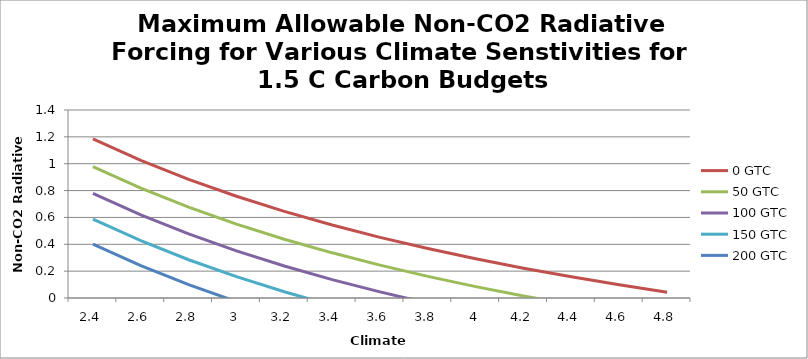
| Category | 0 GTC | 50 GTC | 100 GTC | 150 GTC | 200 GTC |
|---|---|---|---|---|---|
| 2.4 | 1.186 | 0.979 | 0.779 | 0.587 | 0.402 |
| 2.6 | 1.025 | 0.818 | 0.619 | 0.426 | 0.241 |
| 2.8000000000000003 | 0.883 | 0.676 | 0.477 | 0.285 | 0.099 |
| 3.0000000000000004 | 0.757 | 0.55 | 0.351 | 0.159 | -0.027 |
| 3.2000000000000006 | 0.645 | 0.438 | 0.238 | 0.046 | -0.139 |
| 3.400000000000001 | 0.543 | 0.336 | 0.137 | -0.055 | -0.241 |
| 3.600000000000001 | 0.452 | 0.245 | 0.045 | -0.147 | -0.332 |
| 3.800000000000001 | 0.368 | 0.161 | -0.038 | -0.23 | -0.416 |
| 4.000000000000001 | 0.292 | 0.085 | -0.114 | -0.307 | -0.492 |
| 4.200000000000001 | 0.222 | 0.015 | -0.184 | -0.377 | -0.562 |
| 4.400000000000001 | 0.158 | -0.049 | -0.249 | -0.441 | -0.626 |
| 4.600000000000001 | 0.098 | -0.109 | -0.308 | -0.5 | -0.686 |
| 4.800000000000002 | 0.043 | -0.164 | -0.363 | -0.555 | -0.741 |